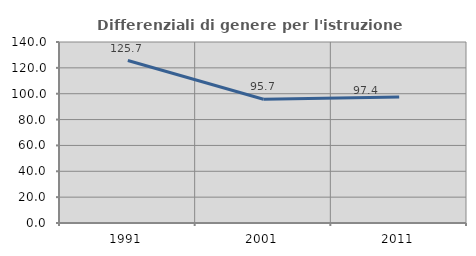
| Category | Differenziali di genere per l'istruzione superiore |
|---|---|
| 1991.0 | 125.656 |
| 2001.0 | 95.702 |
| 2011.0 | 97.427 |